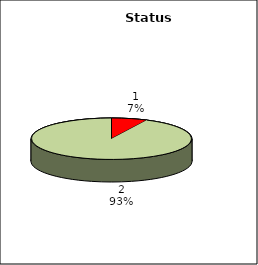
| Category | Series 0 |
|---|---|
| 0 | 1.223 |
| 1 | 15.627 |